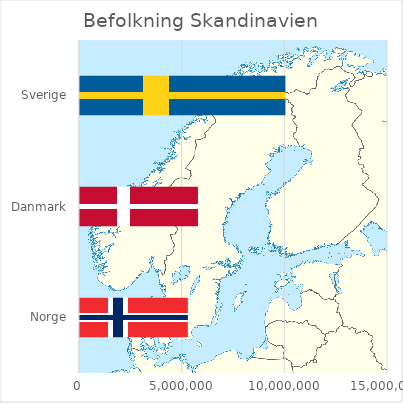
| Category | Befolkning |
|---|---|
| Norge | 5252166 |
| Danmark | 5745526 |
| Sverige | 10004076 |